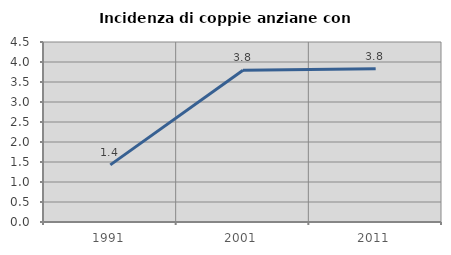
| Category | Incidenza di coppie anziane con figli |
|---|---|
| 1991.0 | 1.429 |
| 2001.0 | 3.791 |
| 2011.0 | 3.83 |